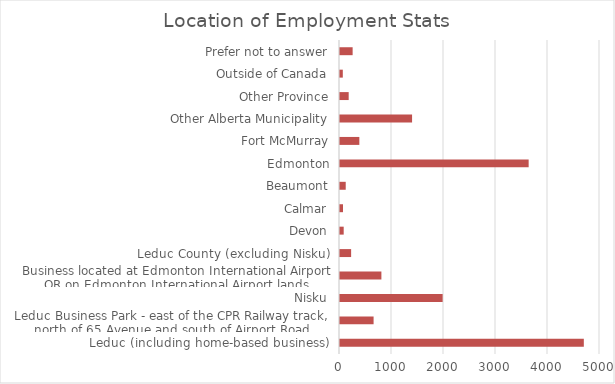
| Category | Series 1 |
|---|---|
| Leduc (including home-based business) | 4689 |
| Leduc Business Park - east of the CPR Railway track, north of 65 Avenue and south of Airport Road | 646 |
| Nisku | 1974 |
| Business located at Edmonton International Airport OR on Edmonton International Airport lands | 796 |
| Leduc County (excluding Nisku) | 214 |
| Devon | 71 |
| Calmar | 58 |
| Beaumont | 110 |
| Edmonton | 3628 |
| Fort McMurray | 372 |
| Other Alberta Municipality | 1386 |
| Other Province | 167 |
| Outside of Canada | 54 |
| Prefer not to answer | 243 |